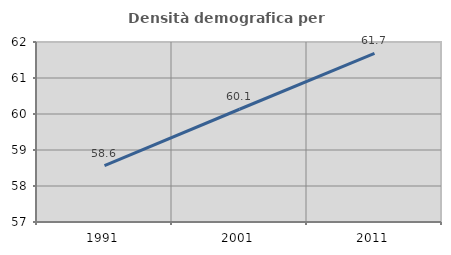
| Category | Densità demografica |
|---|---|
| 1991.0 | 58.565 |
| 2001.0 | 60.132 |
| 2011.0 | 61.684 |